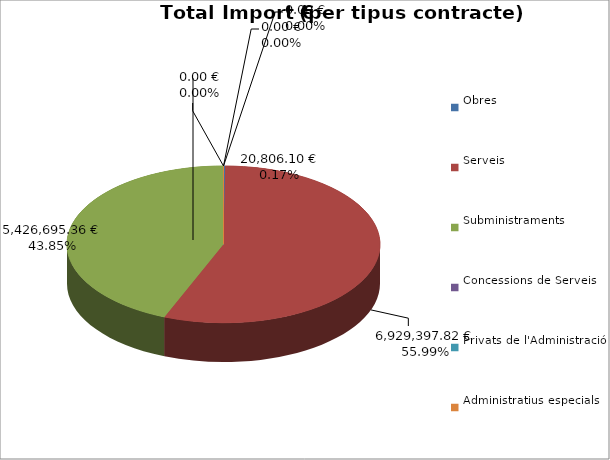
| Category | Total preu
(amb IVA) |
|---|---|
| Obres | 20806.1 |
| Serveis | 6929397.82 |
| Subministraments | 5426695.36 |
| Concessions de Serveis | 0 |
| Privats de l'Administració | 0 |
| Administratius especials | 0 |